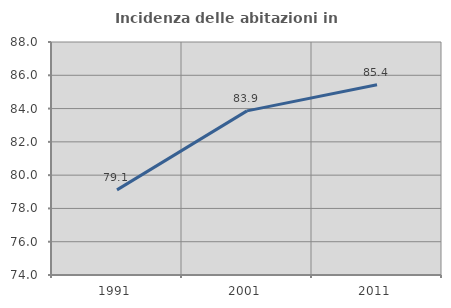
| Category | Incidenza delle abitazioni in proprietà  |
|---|---|
| 1991.0 | 79.115 |
| 2001.0 | 83.862 |
| 2011.0 | 85.434 |